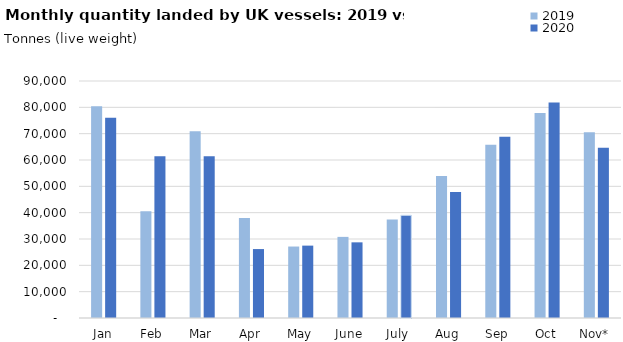
| Category | 2019 | 2020 |
|---|---|---|
| Jan | 80449.291 | 76070.432 |
| Feb | 40561.665 | 61399.204 |
| Mar | 70939.218 | 61380.871 |
| Apr | 38003.491 | 26179.611 |
| May | 27139.703 | 27483.935 |
| June | 30804.211 | 28731.815 |
| July | 37398.356 | 39055.339 |
| Aug | 53963.042 | 47858.504 |
| Sep | 65751.581 | 68791.776 |
| Oct | 77865.008 | 81860.858 |
| Nov* | 70510.226 | 64626.397 |